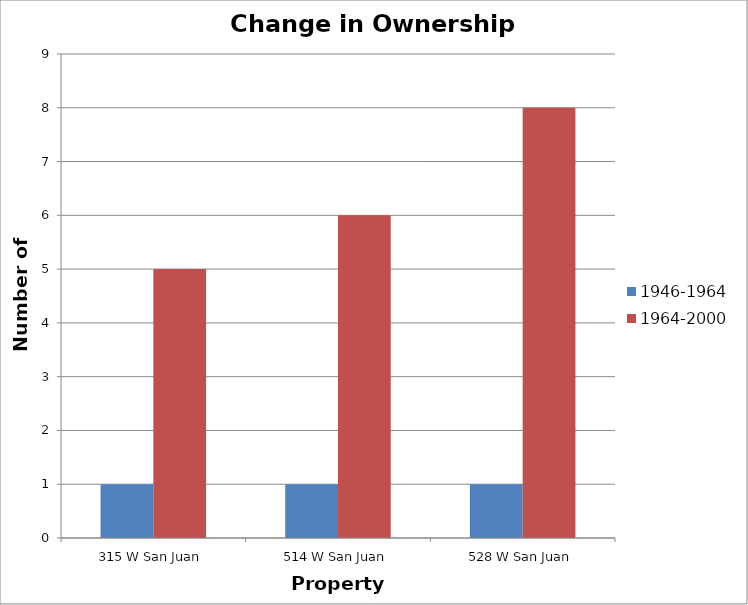
| Category | 1946-1964 | 1964-2000 |
|---|---|---|
| 315 W San Juan | 1 | 5 |
| 514 W San Juan | 1 | 6 |
| 528 W San Juan | 1 | 8 |